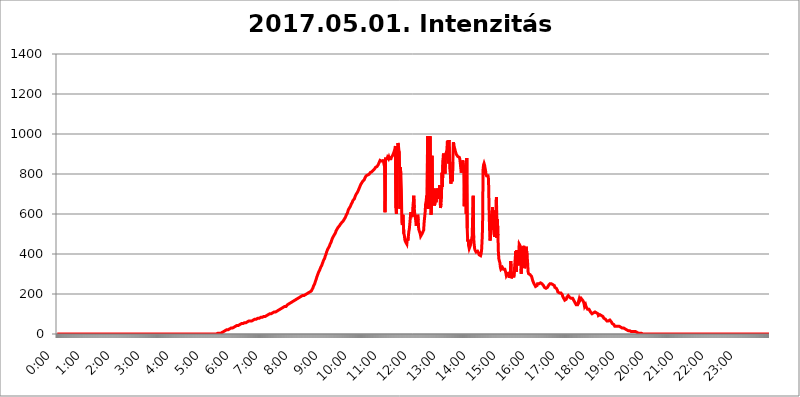
| Category | 2017.05.01. Intenzitás [W/m^2] |
|---|---|
| 0.0 | 0 |
| 0.0006944444444444445 | 0 |
| 0.001388888888888889 | 0 |
| 0.0020833333333333333 | 0 |
| 0.002777777777777778 | 0 |
| 0.003472222222222222 | 0 |
| 0.004166666666666667 | 0 |
| 0.004861111111111111 | 0 |
| 0.005555555555555556 | 0 |
| 0.0062499999999999995 | 0 |
| 0.006944444444444444 | 0 |
| 0.007638888888888889 | 0 |
| 0.008333333333333333 | 0 |
| 0.009027777777777779 | 0 |
| 0.009722222222222222 | 0 |
| 0.010416666666666666 | 0 |
| 0.011111111111111112 | 0 |
| 0.011805555555555555 | 0 |
| 0.012499999999999999 | 0 |
| 0.013194444444444444 | 0 |
| 0.013888888888888888 | 0 |
| 0.014583333333333332 | 0 |
| 0.015277777777777777 | 0 |
| 0.015972222222222224 | 0 |
| 0.016666666666666666 | 0 |
| 0.017361111111111112 | 0 |
| 0.018055555555555557 | 0 |
| 0.01875 | 0 |
| 0.019444444444444445 | 0 |
| 0.02013888888888889 | 0 |
| 0.020833333333333332 | 0 |
| 0.02152777777777778 | 0 |
| 0.022222222222222223 | 0 |
| 0.02291666666666667 | 0 |
| 0.02361111111111111 | 0 |
| 0.024305555555555556 | 0 |
| 0.024999999999999998 | 0 |
| 0.025694444444444447 | 0 |
| 0.02638888888888889 | 0 |
| 0.027083333333333334 | 0 |
| 0.027777777777777776 | 0 |
| 0.02847222222222222 | 0 |
| 0.029166666666666664 | 0 |
| 0.029861111111111113 | 0 |
| 0.030555555555555555 | 0 |
| 0.03125 | 0 |
| 0.03194444444444445 | 0 |
| 0.03263888888888889 | 0 |
| 0.03333333333333333 | 0 |
| 0.034027777777777775 | 0 |
| 0.034722222222222224 | 0 |
| 0.035416666666666666 | 0 |
| 0.036111111111111115 | 0 |
| 0.03680555555555556 | 0 |
| 0.0375 | 0 |
| 0.03819444444444444 | 0 |
| 0.03888888888888889 | 0 |
| 0.03958333333333333 | 0 |
| 0.04027777777777778 | 0 |
| 0.04097222222222222 | 0 |
| 0.041666666666666664 | 0 |
| 0.042361111111111106 | 0 |
| 0.04305555555555556 | 0 |
| 0.043750000000000004 | 0 |
| 0.044444444444444446 | 0 |
| 0.04513888888888889 | 0 |
| 0.04583333333333334 | 0 |
| 0.04652777777777778 | 0 |
| 0.04722222222222222 | 0 |
| 0.04791666666666666 | 0 |
| 0.04861111111111111 | 0 |
| 0.049305555555555554 | 0 |
| 0.049999999999999996 | 0 |
| 0.05069444444444445 | 0 |
| 0.051388888888888894 | 0 |
| 0.052083333333333336 | 0 |
| 0.05277777777777778 | 0 |
| 0.05347222222222222 | 0 |
| 0.05416666666666667 | 0 |
| 0.05486111111111111 | 0 |
| 0.05555555555555555 | 0 |
| 0.05625 | 0 |
| 0.05694444444444444 | 0 |
| 0.057638888888888885 | 0 |
| 0.05833333333333333 | 0 |
| 0.05902777777777778 | 0 |
| 0.059722222222222225 | 0 |
| 0.06041666666666667 | 0 |
| 0.061111111111111116 | 0 |
| 0.06180555555555556 | 0 |
| 0.0625 | 0 |
| 0.06319444444444444 | 0 |
| 0.06388888888888888 | 0 |
| 0.06458333333333334 | 0 |
| 0.06527777777777778 | 0 |
| 0.06597222222222222 | 0 |
| 0.06666666666666667 | 0 |
| 0.06736111111111111 | 0 |
| 0.06805555555555555 | 0 |
| 0.06874999999999999 | 0 |
| 0.06944444444444443 | 0 |
| 0.07013888888888889 | 0 |
| 0.07083333333333333 | 0 |
| 0.07152777777777779 | 0 |
| 0.07222222222222223 | 0 |
| 0.07291666666666667 | 0 |
| 0.07361111111111111 | 0 |
| 0.07430555555555556 | 0 |
| 0.075 | 0 |
| 0.07569444444444444 | 0 |
| 0.0763888888888889 | 0 |
| 0.07708333333333334 | 0 |
| 0.07777777777777778 | 0 |
| 0.07847222222222222 | 0 |
| 0.07916666666666666 | 0 |
| 0.0798611111111111 | 0 |
| 0.08055555555555556 | 0 |
| 0.08125 | 0 |
| 0.08194444444444444 | 0 |
| 0.08263888888888889 | 0 |
| 0.08333333333333333 | 0 |
| 0.08402777777777777 | 0 |
| 0.08472222222222221 | 0 |
| 0.08541666666666665 | 0 |
| 0.08611111111111112 | 0 |
| 0.08680555555555557 | 0 |
| 0.08750000000000001 | 0 |
| 0.08819444444444445 | 0 |
| 0.08888888888888889 | 0 |
| 0.08958333333333333 | 0 |
| 0.09027777777777778 | 0 |
| 0.09097222222222222 | 0 |
| 0.09166666666666667 | 0 |
| 0.09236111111111112 | 0 |
| 0.09305555555555556 | 0 |
| 0.09375 | 0 |
| 0.09444444444444444 | 0 |
| 0.09513888888888888 | 0 |
| 0.09583333333333333 | 0 |
| 0.09652777777777777 | 0 |
| 0.09722222222222222 | 0 |
| 0.09791666666666667 | 0 |
| 0.09861111111111111 | 0 |
| 0.09930555555555555 | 0 |
| 0.09999999999999999 | 0 |
| 0.10069444444444443 | 0 |
| 0.1013888888888889 | 0 |
| 0.10208333333333335 | 0 |
| 0.10277777777777779 | 0 |
| 0.10347222222222223 | 0 |
| 0.10416666666666667 | 0 |
| 0.10486111111111111 | 0 |
| 0.10555555555555556 | 0 |
| 0.10625 | 0 |
| 0.10694444444444444 | 0 |
| 0.1076388888888889 | 0 |
| 0.10833333333333334 | 0 |
| 0.10902777777777778 | 0 |
| 0.10972222222222222 | 0 |
| 0.1111111111111111 | 0 |
| 0.11180555555555556 | 0 |
| 0.11180555555555556 | 0 |
| 0.1125 | 0 |
| 0.11319444444444444 | 0 |
| 0.11388888888888889 | 0 |
| 0.11458333333333333 | 0 |
| 0.11527777777777777 | 0 |
| 0.11597222222222221 | 0 |
| 0.11666666666666665 | 0 |
| 0.1173611111111111 | 0 |
| 0.11805555555555557 | 0 |
| 0.11944444444444445 | 0 |
| 0.12013888888888889 | 0 |
| 0.12083333333333333 | 0 |
| 0.12152777777777778 | 0 |
| 0.12222222222222223 | 0 |
| 0.12291666666666667 | 0 |
| 0.12291666666666667 | 0 |
| 0.12361111111111112 | 0 |
| 0.12430555555555556 | 0 |
| 0.125 | 0 |
| 0.12569444444444444 | 0 |
| 0.12638888888888888 | 0 |
| 0.12708333333333333 | 0 |
| 0.16875 | 0 |
| 0.12847222222222224 | 0 |
| 0.12916666666666668 | 0 |
| 0.12986111111111112 | 0 |
| 0.13055555555555556 | 0 |
| 0.13125 | 0 |
| 0.13194444444444445 | 0 |
| 0.1326388888888889 | 0 |
| 0.13333333333333333 | 0 |
| 0.13402777777777777 | 0 |
| 0.13402777777777777 | 0 |
| 0.13472222222222222 | 0 |
| 0.13541666666666666 | 0 |
| 0.1361111111111111 | 0 |
| 0.13749999999999998 | 0 |
| 0.13819444444444443 | 0 |
| 0.1388888888888889 | 0 |
| 0.13958333333333334 | 0 |
| 0.14027777777777778 | 0 |
| 0.14097222222222222 | 0 |
| 0.14166666666666666 | 0 |
| 0.1423611111111111 | 0 |
| 0.14305555555555557 | 0 |
| 0.14375000000000002 | 0 |
| 0.14444444444444446 | 0 |
| 0.1451388888888889 | 0 |
| 0.1451388888888889 | 0 |
| 0.14652777777777778 | 0 |
| 0.14722222222222223 | 0 |
| 0.14791666666666667 | 0 |
| 0.1486111111111111 | 0 |
| 0.14930555555555555 | 0 |
| 0.15 | 0 |
| 0.15069444444444444 | 0 |
| 0.15138888888888888 | 0 |
| 0.15208333333333332 | 0 |
| 0.15277777777777776 | 0 |
| 0.15347222222222223 | 0 |
| 0.15416666666666667 | 0 |
| 0.15486111111111112 | 0 |
| 0.15555555555555556 | 0 |
| 0.15625 | 0 |
| 0.15694444444444444 | 0 |
| 0.15763888888888888 | 0 |
| 0.15833333333333333 | 0 |
| 0.15902777777777777 | 0 |
| 0.15972222222222224 | 0 |
| 0.16041666666666668 | 0 |
| 0.16111111111111112 | 0 |
| 0.16180555555555556 | 0 |
| 0.1625 | 0 |
| 0.16319444444444445 | 0 |
| 0.1638888888888889 | 0 |
| 0.16458333333333333 | 0 |
| 0.16527777777777777 | 0 |
| 0.16597222222222222 | 0 |
| 0.16666666666666666 | 0 |
| 0.1673611111111111 | 0 |
| 0.16805555555555554 | 0 |
| 0.16874999999999998 | 0 |
| 0.16944444444444443 | 0 |
| 0.17013888888888887 | 0 |
| 0.1708333333333333 | 0 |
| 0.17152777777777775 | 0 |
| 0.17222222222222225 | 0 |
| 0.1729166666666667 | 0 |
| 0.17361111111111113 | 0 |
| 0.17430555555555557 | 0 |
| 0.17500000000000002 | 0 |
| 0.17569444444444446 | 0 |
| 0.1763888888888889 | 0 |
| 0.17708333333333334 | 0 |
| 0.17777777777777778 | 0 |
| 0.17847222222222223 | 0 |
| 0.17916666666666667 | 0 |
| 0.1798611111111111 | 0 |
| 0.18055555555555555 | 0 |
| 0.18125 | 0 |
| 0.18194444444444444 | 0 |
| 0.1826388888888889 | 0 |
| 0.18333333333333335 | 0 |
| 0.1840277777777778 | 0 |
| 0.18472222222222223 | 0 |
| 0.18541666666666667 | 0 |
| 0.18611111111111112 | 0 |
| 0.18680555555555556 | 0 |
| 0.1875 | 0 |
| 0.18819444444444444 | 0 |
| 0.18888888888888888 | 0 |
| 0.18958333333333333 | 0 |
| 0.19027777777777777 | 0 |
| 0.1909722222222222 | 0 |
| 0.19166666666666665 | 0 |
| 0.19236111111111112 | 0 |
| 0.19305555555555554 | 0 |
| 0.19375 | 0 |
| 0.19444444444444445 | 0 |
| 0.1951388888888889 | 0 |
| 0.19583333333333333 | 0 |
| 0.19652777777777777 | 0 |
| 0.19722222222222222 | 0 |
| 0.19791666666666666 | 0 |
| 0.1986111111111111 | 0 |
| 0.19930555555555554 | 0 |
| 0.19999999999999998 | 0 |
| 0.20069444444444443 | 0 |
| 0.20138888888888887 | 0 |
| 0.2020833333333333 | 0 |
| 0.2027777777777778 | 0 |
| 0.2034722222222222 | 0 |
| 0.2041666666666667 | 0 |
| 0.20486111111111113 | 0 |
| 0.20555555555555557 | 0 |
| 0.20625000000000002 | 0 |
| 0.20694444444444446 | 0 |
| 0.2076388888888889 | 0 |
| 0.20833333333333334 | 0 |
| 0.20902777777777778 | 0 |
| 0.20972222222222223 | 0 |
| 0.21041666666666667 | 0 |
| 0.2111111111111111 | 0 |
| 0.21180555555555555 | 0 |
| 0.2125 | 0 |
| 0.21319444444444444 | 0 |
| 0.2138888888888889 | 0 |
| 0.21458333333333335 | 0 |
| 0.2152777777777778 | 0 |
| 0.21597222222222223 | 0 |
| 0.21666666666666667 | 0 |
| 0.21736111111111112 | 0 |
| 0.21805555555555556 | 0 |
| 0.21875 | 0 |
| 0.21944444444444444 | 0 |
| 0.22013888888888888 | 0 |
| 0.22083333333333333 | 0 |
| 0.22152777777777777 | 0 |
| 0.2222222222222222 | 0 |
| 0.22291666666666665 | 0 |
| 0.2236111111111111 | 3.525 |
| 0.22430555555555556 | 3.525 |
| 0.225 | 3.525 |
| 0.22569444444444445 | 3.525 |
| 0.2263888888888889 | 3.525 |
| 0.22708333333333333 | 3.525 |
| 0.22777777777777777 | 3.525 |
| 0.22847222222222222 | 3.525 |
| 0.22916666666666666 | 3.525 |
| 0.2298611111111111 | 7.887 |
| 0.23055555555555554 | 7.887 |
| 0.23124999999999998 | 7.887 |
| 0.23194444444444443 | 12.257 |
| 0.23263888888888887 | 12.257 |
| 0.2333333333333333 | 12.257 |
| 0.2340277777777778 | 12.257 |
| 0.2347222222222222 | 16.636 |
| 0.2354166666666667 | 16.636 |
| 0.23611111111111113 | 16.636 |
| 0.23680555555555557 | 16.636 |
| 0.23750000000000002 | 21.024 |
| 0.23819444444444446 | 21.024 |
| 0.2388888888888889 | 21.024 |
| 0.23958333333333334 | 21.024 |
| 0.24027777777777778 | 25.419 |
| 0.24097222222222223 | 25.419 |
| 0.24166666666666667 | 25.419 |
| 0.2423611111111111 | 25.419 |
| 0.24305555555555555 | 29.823 |
| 0.24375 | 29.823 |
| 0.24444444444444446 | 29.823 |
| 0.24513888888888888 | 29.823 |
| 0.24583333333333335 | 29.823 |
| 0.2465277777777778 | 34.234 |
| 0.24722222222222223 | 34.234 |
| 0.24791666666666667 | 34.234 |
| 0.24861111111111112 | 38.653 |
| 0.24930555555555556 | 38.653 |
| 0.25 | 38.653 |
| 0.25069444444444444 | 38.653 |
| 0.2513888888888889 | 38.653 |
| 0.2520833333333333 | 43.079 |
| 0.25277777777777777 | 43.079 |
| 0.2534722222222222 | 43.079 |
| 0.25416666666666665 | 43.079 |
| 0.2548611111111111 | 47.511 |
| 0.2555555555555556 | 47.511 |
| 0.25625000000000003 | 47.511 |
| 0.2569444444444445 | 47.511 |
| 0.2576388888888889 | 47.511 |
| 0.25833333333333336 | 51.951 |
| 0.2590277777777778 | 51.951 |
| 0.25972222222222224 | 51.951 |
| 0.2604166666666667 | 51.951 |
| 0.2611111111111111 | 51.951 |
| 0.26180555555555557 | 56.398 |
| 0.2625 | 56.398 |
| 0.26319444444444445 | 56.398 |
| 0.2638888888888889 | 56.398 |
| 0.26458333333333334 | 56.398 |
| 0.2652777777777778 | 56.398 |
| 0.2659722222222222 | 60.85 |
| 0.26666666666666666 | 60.85 |
| 0.2673611111111111 | 60.85 |
| 0.26805555555555555 | 60.85 |
| 0.26875 | 65.31 |
| 0.26944444444444443 | 65.31 |
| 0.2701388888888889 | 65.31 |
| 0.2708333333333333 | 65.31 |
| 0.27152777777777776 | 65.31 |
| 0.2722222222222222 | 65.31 |
| 0.27291666666666664 | 65.31 |
| 0.2736111111111111 | 69.775 |
| 0.2743055555555555 | 69.775 |
| 0.27499999999999997 | 69.775 |
| 0.27569444444444446 | 69.775 |
| 0.27638888888888885 | 74.246 |
| 0.27708333333333335 | 74.246 |
| 0.2777777777777778 | 74.246 |
| 0.27847222222222223 | 74.246 |
| 0.2791666666666667 | 74.246 |
| 0.2798611111111111 | 74.246 |
| 0.28055555555555556 | 74.246 |
| 0.28125 | 78.722 |
| 0.28194444444444444 | 78.722 |
| 0.2826388888888889 | 78.722 |
| 0.2833333333333333 | 78.722 |
| 0.28402777777777777 | 83.205 |
| 0.2847222222222222 | 83.205 |
| 0.28541666666666665 | 83.205 |
| 0.28611111111111115 | 83.205 |
| 0.28680555555555554 | 83.205 |
| 0.28750000000000003 | 83.205 |
| 0.2881944444444445 | 83.205 |
| 0.2888888888888889 | 87.692 |
| 0.28958333333333336 | 87.692 |
| 0.2902777777777778 | 87.692 |
| 0.29097222222222224 | 87.692 |
| 0.2916666666666667 | 87.692 |
| 0.2923611111111111 | 92.184 |
| 0.29305555555555557 | 92.184 |
| 0.29375 | 92.184 |
| 0.29444444444444445 | 92.184 |
| 0.2951388888888889 | 92.184 |
| 0.29583333333333334 | 96.682 |
| 0.2965277777777778 | 96.682 |
| 0.2972222222222222 | 96.682 |
| 0.29791666666666666 | 101.184 |
| 0.2986111111111111 | 101.184 |
| 0.29930555555555555 | 101.184 |
| 0.3 | 101.184 |
| 0.30069444444444443 | 101.184 |
| 0.3013888888888889 | 105.69 |
| 0.3020833333333333 | 105.69 |
| 0.30277777777777776 | 105.69 |
| 0.3034722222222222 | 110.201 |
| 0.30416666666666664 | 110.201 |
| 0.3048611111111111 | 110.201 |
| 0.3055555555555555 | 110.201 |
| 0.30624999999999997 | 110.201 |
| 0.3069444444444444 | 114.716 |
| 0.3076388888888889 | 114.716 |
| 0.30833333333333335 | 114.716 |
| 0.3090277777777778 | 119.235 |
| 0.30972222222222223 | 119.235 |
| 0.3104166666666667 | 119.235 |
| 0.3111111111111111 | 119.235 |
| 0.31180555555555556 | 123.758 |
| 0.3125 | 123.758 |
| 0.31319444444444444 | 123.758 |
| 0.3138888888888889 | 128.284 |
| 0.3145833333333333 | 128.284 |
| 0.31527777777777777 | 128.284 |
| 0.3159722222222222 | 128.284 |
| 0.31666666666666665 | 132.814 |
| 0.31736111111111115 | 132.814 |
| 0.31805555555555554 | 132.814 |
| 0.31875000000000003 | 137.347 |
| 0.3194444444444445 | 137.347 |
| 0.3201388888888889 | 137.347 |
| 0.32083333333333336 | 137.347 |
| 0.3215277777777778 | 141.884 |
| 0.32222222222222224 | 141.884 |
| 0.3229166666666667 | 146.423 |
| 0.3236111111111111 | 146.423 |
| 0.32430555555555557 | 146.423 |
| 0.325 | 150.964 |
| 0.32569444444444445 | 150.964 |
| 0.3263888888888889 | 150.964 |
| 0.32708333333333334 | 155.509 |
| 0.3277777777777778 | 155.509 |
| 0.3284722222222222 | 155.509 |
| 0.32916666666666666 | 160.056 |
| 0.3298611111111111 | 160.056 |
| 0.33055555555555555 | 160.056 |
| 0.33125 | 164.605 |
| 0.33194444444444443 | 164.605 |
| 0.3326388888888889 | 164.605 |
| 0.3333333333333333 | 169.156 |
| 0.3340277777777778 | 169.156 |
| 0.3347222222222222 | 173.709 |
| 0.3354166666666667 | 173.709 |
| 0.3361111111111111 | 173.709 |
| 0.3368055555555556 | 173.709 |
| 0.33749999999999997 | 178.264 |
| 0.33819444444444446 | 178.264 |
| 0.33888888888888885 | 182.82 |
| 0.33958333333333335 | 182.82 |
| 0.34027777777777773 | 182.82 |
| 0.34097222222222223 | 182.82 |
| 0.3416666666666666 | 187.378 |
| 0.3423611111111111 | 187.378 |
| 0.3430555555555555 | 187.378 |
| 0.34375 | 191.937 |
| 0.3444444444444445 | 191.937 |
| 0.3451388888888889 | 191.937 |
| 0.3458333333333334 | 191.937 |
| 0.34652777777777777 | 196.497 |
| 0.34722222222222227 | 196.497 |
| 0.34791666666666665 | 196.497 |
| 0.34861111111111115 | 201.058 |
| 0.34930555555555554 | 201.058 |
| 0.35000000000000003 | 201.058 |
| 0.3506944444444444 | 205.62 |
| 0.3513888888888889 | 205.62 |
| 0.3520833333333333 | 205.62 |
| 0.3527777777777778 | 210.182 |
| 0.3534722222222222 | 210.182 |
| 0.3541666666666667 | 210.182 |
| 0.3548611111111111 | 214.746 |
| 0.35555555555555557 | 214.746 |
| 0.35625 | 214.746 |
| 0.35694444444444445 | 219.309 |
| 0.3576388888888889 | 219.309 |
| 0.35833333333333334 | 228.436 |
| 0.3590277777777778 | 233 |
| 0.3597222222222222 | 242.127 |
| 0.36041666666666666 | 246.689 |
| 0.3611111111111111 | 251.251 |
| 0.36180555555555555 | 260.373 |
| 0.3625 | 264.932 |
| 0.36319444444444443 | 274.047 |
| 0.3638888888888889 | 283.156 |
| 0.3645833333333333 | 287.709 |
| 0.3652777777777778 | 296.808 |
| 0.3659722222222222 | 301.354 |
| 0.3666666666666667 | 310.44 |
| 0.3673611111111111 | 314.98 |
| 0.3680555555555556 | 319.517 |
| 0.36874999999999997 | 324.052 |
| 0.36944444444444446 | 333.113 |
| 0.37013888888888885 | 337.639 |
| 0.37083333333333335 | 342.162 |
| 0.37152777777777773 | 346.682 |
| 0.37222222222222223 | 355.712 |
| 0.3729166666666666 | 360.221 |
| 0.3736111111111111 | 369.23 |
| 0.3743055555555555 | 373.729 |
| 0.375 | 378.224 |
| 0.3756944444444445 | 387.202 |
| 0.3763888888888889 | 391.685 |
| 0.3770833333333334 | 400.638 |
| 0.37777777777777777 | 409.574 |
| 0.37847222222222227 | 414.035 |
| 0.37916666666666665 | 422.943 |
| 0.37986111111111115 | 422.943 |
| 0.38055555555555554 | 431.833 |
| 0.38125000000000003 | 436.27 |
| 0.3819444444444444 | 440.702 |
| 0.3826388888888889 | 449.551 |
| 0.3833333333333333 | 453.968 |
| 0.3840277777777778 | 458.38 |
| 0.3847222222222222 | 467.187 |
| 0.3854166666666667 | 471.582 |
| 0.3861111111111111 | 480.356 |
| 0.38680555555555557 | 484.735 |
| 0.3875 | 489.108 |
| 0.38819444444444445 | 493.475 |
| 0.3888888888888889 | 497.836 |
| 0.38958333333333334 | 502.192 |
| 0.3902777777777778 | 506.542 |
| 0.3909722222222222 | 515.223 |
| 0.39166666666666666 | 515.223 |
| 0.3923611111111111 | 523.88 |
| 0.39305555555555555 | 528.2 |
| 0.39375 | 532.513 |
| 0.39444444444444443 | 532.513 |
| 0.3951388888888889 | 536.82 |
| 0.3958333333333333 | 541.121 |
| 0.3965277777777778 | 545.416 |
| 0.3972222222222222 | 549.704 |
| 0.3979166666666667 | 549.704 |
| 0.3986111111111111 | 549.704 |
| 0.3993055555555556 | 558.261 |
| 0.39999999999999997 | 558.261 |
| 0.40069444444444446 | 562.53 |
| 0.40138888888888885 | 566.793 |
| 0.40208333333333335 | 566.793 |
| 0.40277777777777773 | 575.299 |
| 0.40347222222222223 | 579.542 |
| 0.4041666666666666 | 583.779 |
| 0.4048611111111111 | 588.009 |
| 0.4055555555555555 | 596.45 |
| 0.40625 | 600.661 |
| 0.4069444444444445 | 604.864 |
| 0.4076388888888889 | 613.252 |
| 0.4083333333333334 | 621.613 |
| 0.40902777777777777 | 625.784 |
| 0.40972222222222227 | 629.948 |
| 0.41041666666666665 | 634.105 |
| 0.41111111111111115 | 638.256 |
| 0.41180555555555554 | 642.4 |
| 0.41250000000000003 | 650.667 |
| 0.4131944444444444 | 654.791 |
| 0.4138888888888889 | 658.909 |
| 0.4145833333333333 | 667.123 |
| 0.4152777777777778 | 667.123 |
| 0.4159722222222222 | 667.123 |
| 0.4166666666666667 | 675.311 |
| 0.4173611111111111 | 683.473 |
| 0.41805555555555557 | 687.544 |
| 0.41875 | 695.666 |
| 0.41944444444444445 | 699.717 |
| 0.4201388888888889 | 703.762 |
| 0.42083333333333334 | 707.8 |
| 0.4215277777777778 | 711.832 |
| 0.4222222222222222 | 715.858 |
| 0.42291666666666666 | 723.889 |
| 0.4236111111111111 | 727.896 |
| 0.42430555555555555 | 735.89 |
| 0.425 | 739.877 |
| 0.42569444444444443 | 747.834 |
| 0.4263888888888889 | 751.803 |
| 0.4270833333333333 | 755.766 |
| 0.4277777777777778 | 759.723 |
| 0.4284722222222222 | 763.674 |
| 0.4291666666666667 | 767.62 |
| 0.4298611111111111 | 767.62 |
| 0.4305555555555556 | 771.559 |
| 0.43124999999999997 | 775.492 |
| 0.43194444444444446 | 783.342 |
| 0.43263888888888885 | 787.258 |
| 0.43333333333333335 | 791.169 |
| 0.43402777777777773 | 791.169 |
| 0.43472222222222223 | 795.074 |
| 0.4354166666666666 | 795.074 |
| 0.4361111111111111 | 795.074 |
| 0.4368055555555555 | 798.974 |
| 0.4375 | 798.974 |
| 0.4381944444444445 | 798.974 |
| 0.4388888888888889 | 806.757 |
| 0.4395833333333334 | 802.868 |
| 0.44027777777777777 | 806.757 |
| 0.44097222222222227 | 810.641 |
| 0.44166666666666665 | 814.519 |
| 0.44236111111111115 | 814.519 |
| 0.44305555555555554 | 818.392 |
| 0.44375000000000003 | 822.26 |
| 0.4444444444444444 | 822.26 |
| 0.4451388888888889 | 826.123 |
| 0.4458333333333333 | 829.981 |
| 0.4465277777777778 | 833.834 |
| 0.4472222222222222 | 833.834 |
| 0.4479166666666667 | 837.682 |
| 0.4486111111111111 | 837.682 |
| 0.44930555555555557 | 837.682 |
| 0.45 | 845.365 |
| 0.45069444444444445 | 849.199 |
| 0.4513888888888889 | 856.855 |
| 0.45208333333333334 | 860.676 |
| 0.4527777777777778 | 868.305 |
| 0.4534722222222222 | 864.493 |
| 0.45416666666666666 | 864.493 |
| 0.4548611111111111 | 864.493 |
| 0.45555555555555555 | 860.676 |
| 0.45625 | 868.305 |
| 0.45694444444444443 | 864.493 |
| 0.4576388888888889 | 872.114 |
| 0.4583333333333333 | 868.305 |
| 0.4590277777777778 | 837.682 |
| 0.4597222222222222 | 609.062 |
| 0.4604166666666667 | 875.918 |
| 0.4611111111111111 | 872.114 |
| 0.4618055555555556 | 872.114 |
| 0.46249999999999997 | 875.918 |
| 0.46319444444444446 | 883.516 |
| 0.46388888888888885 | 883.516 |
| 0.46458333333333335 | 875.918 |
| 0.46527777777777773 | 883.516 |
| 0.46597222222222223 | 875.918 |
| 0.4666666666666666 | 872.114 |
| 0.4673611111111111 | 875.918 |
| 0.4680555555555555 | 875.918 |
| 0.46875 | 883.516 |
| 0.4694444444444445 | 887.309 |
| 0.4701388888888889 | 891.099 |
| 0.4708333333333334 | 894.885 |
| 0.47152777777777777 | 902.447 |
| 0.47222222222222227 | 909.996 |
| 0.47291666666666665 | 917.534 |
| 0.47361111111111115 | 925.06 |
| 0.47430555555555554 | 940.082 |
| 0.47500000000000003 | 629.948 |
| 0.4756944444444444 | 600.661 |
| 0.4763888888888889 | 783.342 |
| 0.4770833333333333 | 906.223 |
| 0.4777777777777778 | 955.071 |
| 0.4784722222222222 | 943.832 |
| 0.4791666666666667 | 917.534 |
| 0.4798611111111111 | 909.996 |
| 0.48055555555555557 | 625.784 |
| 0.48125 | 833.834 |
| 0.48194444444444445 | 795.074 |
| 0.4826388888888889 | 723.889 |
| 0.48333333333333334 | 558.261 |
| 0.4840277777777778 | 545.416 |
| 0.4847222222222222 | 596.45 |
| 0.48541666666666666 | 592.233 |
| 0.4861111111111111 | 502.192 |
| 0.48680555555555555 | 493.475 |
| 0.4875 | 471.582 |
| 0.48819444444444443 | 462.786 |
| 0.4888888888888889 | 458.38 |
| 0.4895833333333333 | 458.38 |
| 0.4902777777777778 | 449.551 |
| 0.4909722222222222 | 475.972 |
| 0.4916666666666667 | 467.187 |
| 0.4923611111111111 | 484.735 |
| 0.4930555555555556 | 510.885 |
| 0.49374999999999997 | 523.88 |
| 0.49444444444444446 | 549.704 |
| 0.49513888888888885 | 553.986 |
| 0.49583333333333335 | 609.062 |
| 0.49652777777777773 | 609.062 |
| 0.49722222222222223 | 596.45 |
| 0.4979166666666666 | 604.864 |
| 0.4986111111111111 | 588.009 |
| 0.4993055555555555 | 650.667 |
| 0.5 | 691.608 |
| 0.5006944444444444 | 629.948 |
| 0.5013888888888889 | 600.661 |
| 0.5020833333333333 | 600.661 |
| 0.5027777777777778 | 566.793 |
| 0.5034722222222222 | 541.121 |
| 0.5041666666666667 | 549.704 |
| 0.5048611111111111 | 566.793 |
| 0.5055555555555555 | 596.45 |
| 0.50625 | 571.049 |
| 0.5069444444444444 | 523.88 |
| 0.5076388888888889 | 519.555 |
| 0.5083333333333333 | 528.2 |
| 0.5090277777777777 | 502.192 |
| 0.5097222222222222 | 489.108 |
| 0.5104166666666666 | 484.735 |
| 0.5111111111111112 | 489.108 |
| 0.5118055555555555 | 502.192 |
| 0.5125000000000001 | 502.192 |
| 0.5131944444444444 | 502.192 |
| 0.513888888888889 | 519.555 |
| 0.5145833333333333 | 558.261 |
| 0.5152777777777778 | 583.779 |
| 0.5159722222222222 | 609.062 |
| 0.5166666666666667 | 650.667 |
| 0.517361111111111 | 663.019 |
| 0.5180555555555556 | 691.608 |
| 0.5187499999999999 | 658.909 |
| 0.5194444444444445 | 988.714 |
| 0.5201388888888888 | 625.784 |
| 0.5208333333333334 | 650.667 |
| 0.5215277777777778 | 727.896 |
| 0.5222222222222223 | 826.123 |
| 0.5229166666666667 | 988.714 |
| 0.5236111111111111 | 759.723 |
| 0.5243055555555556 | 596.45 |
| 0.525 | 646.537 |
| 0.5256944444444445 | 891.099 |
| 0.5263888888888889 | 671.22 |
| 0.5270833333333333 | 658.909 |
| 0.5277777777777778 | 671.22 |
| 0.5284722222222222 | 727.896 |
| 0.5291666666666667 | 642.4 |
| 0.5298611111111111 | 658.909 |
| 0.5305555555555556 | 719.877 |
| 0.53125 | 658.909 |
| 0.5319444444444444 | 691.608 |
| 0.5326388888888889 | 727.896 |
| 0.5333333333333333 | 711.832 |
| 0.5340277777777778 | 715.858 |
| 0.5347222222222222 | 675.311 |
| 0.5354166666666667 | 683.473 |
| 0.5361111111111111 | 743.859 |
| 0.5368055555555555 | 695.666 |
| 0.5375 | 629.948 |
| 0.5381944444444444 | 650.667 |
| 0.5388888888888889 | 683.473 |
| 0.5395833333333333 | 806.757 |
| 0.5402777777777777 | 735.89 |
| 0.5409722222222222 | 868.305 |
| 0.5416666666666666 | 902.447 |
| 0.5423611111111112 | 872.114 |
| 0.5430555555555555 | 883.516 |
| 0.5437500000000001 | 802.868 |
| 0.5444444444444444 | 879.719 |
| 0.545138888888889 | 902.447 |
| 0.5458333333333333 | 909.996 |
| 0.5465277777777778 | 921.298 |
| 0.5472222222222222 | 966.295 |
| 0.5479166666666667 | 932.576 |
| 0.548611111111111 | 853.029 |
| 0.5493055555555556 | 970.034 |
| 0.5499999999999999 | 894.885 |
| 0.5506944444444445 | 822.26 |
| 0.5513888888888888 | 798.974 |
| 0.5520833333333334 | 751.803 |
| 0.5527777777777778 | 755.766 |
| 0.5534722222222223 | 818.392 |
| 0.5541666666666667 | 763.674 |
| 0.5548611111111111 | 860.676 |
| 0.5555555555555556 | 958.814 |
| 0.55625 | 947.58 |
| 0.5569444444444445 | 932.576 |
| 0.5576388888888889 | 925.06 |
| 0.5583333333333333 | 913.766 |
| 0.5590277777777778 | 906.223 |
| 0.5597222222222222 | 898.668 |
| 0.5604166666666667 | 894.885 |
| 0.5611111111111111 | 894.885 |
| 0.5618055555555556 | 887.309 |
| 0.5625 | 883.516 |
| 0.5631944444444444 | 887.309 |
| 0.5638888888888889 | 883.516 |
| 0.5645833333333333 | 875.918 |
| 0.5652777777777778 | 879.719 |
| 0.5659722222222222 | 879.719 |
| 0.5666666666666667 | 806.757 |
| 0.5673611111111111 | 829.981 |
| 0.5680555555555555 | 841.526 |
| 0.56875 | 868.305 |
| 0.5694444444444444 | 864.493 |
| 0.5701388888888889 | 829.981 |
| 0.5708333333333333 | 638.256 |
| 0.5715277777777777 | 845.365 |
| 0.5722222222222222 | 826.123 |
| 0.5729166666666666 | 743.859 |
| 0.5736111111111112 | 600.661 |
| 0.5743055555555555 | 879.719 |
| 0.5750000000000001 | 528.2 |
| 0.5756944444444444 | 462.786 |
| 0.576388888888889 | 471.582 |
| 0.5770833333333333 | 440.702 |
| 0.5777777777777778 | 427.39 |
| 0.5784722222222222 | 427.39 |
| 0.5791666666666667 | 440.702 |
| 0.579861111111111 | 449.551 |
| 0.5805555555555556 | 458.38 |
| 0.5812499999999999 | 475.972 |
| 0.5819444444444445 | 489.108 |
| 0.5826388888888888 | 489.108 |
| 0.5833333333333334 | 691.608 |
| 0.5840277777777778 | 480.356 |
| 0.5847222222222223 | 449.551 |
| 0.5854166666666667 | 427.39 |
| 0.5861111111111111 | 418.492 |
| 0.5868055555555556 | 414.035 |
| 0.5875 | 409.574 |
| 0.5881944444444445 | 405.108 |
| 0.5888888888888889 | 405.108 |
| 0.5895833333333333 | 414.035 |
| 0.5902777777777778 | 418.492 |
| 0.5909722222222222 | 405.108 |
| 0.5916666666666667 | 396.164 |
| 0.5923611111111111 | 391.685 |
| 0.5930555555555556 | 391.685 |
| 0.59375 | 391.685 |
| 0.5944444444444444 | 400.638 |
| 0.5951388888888889 | 418.492 |
| 0.5958333333333333 | 467.187 |
| 0.5965277777777778 | 532.513 |
| 0.5972222222222222 | 822.26 |
| 0.5979166666666667 | 845.365 |
| 0.5986111111111111 | 853.029 |
| 0.5993055555555555 | 845.365 |
| 0.6 | 829.981 |
| 0.6006944444444444 | 818.392 |
| 0.6013888888888889 | 798.974 |
| 0.6020833333333333 | 791.169 |
| 0.6027777777777777 | 791.169 |
| 0.6034722222222222 | 795.074 |
| 0.6041666666666666 | 791.169 |
| 0.6048611111111112 | 775.492 |
| 0.6055555555555555 | 646.537 |
| 0.6062500000000001 | 532.513 |
| 0.6069444444444444 | 467.187 |
| 0.607638888888889 | 484.735 |
| 0.6083333333333333 | 515.223 |
| 0.6090277777777778 | 600.661 |
| 0.6097222222222222 | 532.513 |
| 0.6104166666666667 | 634.105 |
| 0.611111111111111 | 553.986 |
| 0.6118055555555556 | 519.555 |
| 0.6124999999999999 | 566.793 |
| 0.6131944444444445 | 484.735 |
| 0.6138888888888888 | 480.356 |
| 0.6145833333333334 | 617.436 |
| 0.6152777777777778 | 575.299 |
| 0.6159722222222223 | 683.473 |
| 0.6166666666666667 | 480.356 |
| 0.6173611111111111 | 575.299 |
| 0.6180555555555556 | 493.475 |
| 0.61875 | 405.108 |
| 0.6194444444444445 | 373.729 |
| 0.6201388888888889 | 364.728 |
| 0.6208333333333333 | 355.712 |
| 0.6215277777777778 | 333.113 |
| 0.6222222222222222 | 324.052 |
| 0.6229166666666667 | 324.052 |
| 0.6236111111111111 | 328.584 |
| 0.6243055555555556 | 333.113 |
| 0.625 | 328.584 |
| 0.6256944444444444 | 324.052 |
| 0.6263888888888889 | 328.584 |
| 0.6270833333333333 | 324.052 |
| 0.6277777777777778 | 324.052 |
| 0.6284722222222222 | 314.98 |
| 0.6291666666666667 | 305.898 |
| 0.6298611111111111 | 292.259 |
| 0.6305555555555555 | 287.709 |
| 0.63125 | 301.354 |
| 0.6319444444444444 | 310.44 |
| 0.6326388888888889 | 296.808 |
| 0.6333333333333333 | 287.709 |
| 0.6340277777777777 | 287.709 |
| 0.6347222222222222 | 283.156 |
| 0.6354166666666666 | 287.709 |
| 0.6361111111111112 | 364.728 |
| 0.6368055555555555 | 278.603 |
| 0.6375000000000001 | 274.047 |
| 0.6381944444444444 | 283.156 |
| 0.638888888888889 | 296.808 |
| 0.6395833333333333 | 296.808 |
| 0.6402777777777778 | 283.156 |
| 0.6409722222222222 | 310.44 |
| 0.6416666666666667 | 310.44 |
| 0.642361111111111 | 314.98 |
| 0.6430555555555556 | 414.035 |
| 0.6437499999999999 | 310.44 |
| 0.6444444444444445 | 418.492 |
| 0.6451388888888888 | 360.221 |
| 0.6458333333333334 | 351.198 |
| 0.6465277777777778 | 342.162 |
| 0.6472222222222223 | 405.108 |
| 0.6479166666666667 | 449.551 |
| 0.6486111111111111 | 449.551 |
| 0.6493055555555556 | 440.702 |
| 0.65 | 431.833 |
| 0.6506944444444445 | 301.354 |
| 0.6513888888888889 | 301.354 |
| 0.6520833333333333 | 422.943 |
| 0.6527777777777778 | 346.682 |
| 0.6534722222222222 | 378.224 |
| 0.6541666666666667 | 440.702 |
| 0.6548611111111111 | 355.712 |
| 0.6555555555555556 | 328.584 |
| 0.65625 | 333.113 |
| 0.6569444444444444 | 351.198 |
| 0.6576388888888889 | 436.27 |
| 0.6583333333333333 | 440.702 |
| 0.6590277777777778 | 391.685 |
| 0.6597222222222222 | 355.712 |
| 0.6604166666666667 | 310.44 |
| 0.6611111111111111 | 301.354 |
| 0.6618055555555555 | 305.898 |
| 0.6625 | 296.808 |
| 0.6631944444444444 | 296.808 |
| 0.6638888888888889 | 292.259 |
| 0.6645833333333333 | 301.354 |
| 0.6652777777777777 | 287.709 |
| 0.6659722222222222 | 278.603 |
| 0.6666666666666666 | 269.49 |
| 0.6673611111111111 | 264.932 |
| 0.6680555555555556 | 255.813 |
| 0.6687500000000001 | 251.251 |
| 0.6694444444444444 | 246.689 |
| 0.6701388888888888 | 242.127 |
| 0.6708333333333334 | 237.564 |
| 0.6715277777777778 | 242.127 |
| 0.6722222222222222 | 242.127 |
| 0.6729166666666666 | 242.127 |
| 0.6736111111111112 | 251.251 |
| 0.6743055555555556 | 251.251 |
| 0.6749999999999999 | 246.689 |
| 0.6756944444444444 | 251.251 |
| 0.6763888888888889 | 255.813 |
| 0.6770833333333334 | 255.813 |
| 0.6777777777777777 | 255.813 |
| 0.6784722222222223 | 255.813 |
| 0.6791666666666667 | 251.251 |
| 0.6798611111111111 | 251.251 |
| 0.6805555555555555 | 251.251 |
| 0.68125 | 246.689 |
| 0.6819444444444445 | 242.127 |
| 0.6826388888888889 | 237.564 |
| 0.6833333333333332 | 233 |
| 0.6840277777777778 | 228.436 |
| 0.6847222222222222 | 233 |
| 0.6854166666666667 | 228.436 |
| 0.686111111111111 | 228.436 |
| 0.6868055555555556 | 233 |
| 0.6875 | 233 |
| 0.6881944444444444 | 237.564 |
| 0.688888888888889 | 242.127 |
| 0.6895833333333333 | 246.689 |
| 0.6902777777777778 | 246.689 |
| 0.6909722222222222 | 251.251 |
| 0.6916666666666668 | 251.251 |
| 0.6923611111111111 | 251.251 |
| 0.6930555555555555 | 251.251 |
| 0.69375 | 251.251 |
| 0.6944444444444445 | 251.251 |
| 0.6951388888888889 | 246.689 |
| 0.6958333333333333 | 246.689 |
| 0.6965277777777777 | 246.689 |
| 0.6972222222222223 | 242.127 |
| 0.6979166666666666 | 233 |
| 0.6986111111111111 | 233 |
| 0.6993055555555556 | 228.436 |
| 0.7000000000000001 | 228.436 |
| 0.7006944444444444 | 223.873 |
| 0.7013888888888888 | 219.309 |
| 0.7020833333333334 | 210.182 |
| 0.7027777777777778 | 210.182 |
| 0.7034722222222222 | 205.62 |
| 0.7041666666666666 | 205.62 |
| 0.7048611111111112 | 201.058 |
| 0.7055555555555556 | 201.058 |
| 0.7062499999999999 | 205.62 |
| 0.7069444444444444 | 205.62 |
| 0.7076388888888889 | 205.62 |
| 0.7083333333333334 | 196.497 |
| 0.7090277777777777 | 187.378 |
| 0.7097222222222223 | 182.82 |
| 0.7104166666666667 | 178.264 |
| 0.7111111111111111 | 173.709 |
| 0.7118055555555555 | 169.156 |
| 0.7125 | 164.605 |
| 0.7131944444444445 | 169.156 |
| 0.7138888888888889 | 173.709 |
| 0.7145833333333332 | 182.82 |
| 0.7152777777777778 | 187.378 |
| 0.7159722222222222 | 187.378 |
| 0.7166666666666667 | 191.937 |
| 0.717361111111111 | 191.937 |
| 0.7180555555555556 | 187.378 |
| 0.71875 | 182.82 |
| 0.7194444444444444 | 182.82 |
| 0.720138888888889 | 178.264 |
| 0.7208333333333333 | 178.264 |
| 0.7215277777777778 | 178.264 |
| 0.7222222222222222 | 178.264 |
| 0.7229166666666668 | 178.264 |
| 0.7236111111111111 | 178.264 |
| 0.7243055555555555 | 173.709 |
| 0.725 | 164.605 |
| 0.7256944444444445 | 164.605 |
| 0.7263888888888889 | 155.509 |
| 0.7270833333333333 | 150.964 |
| 0.7277777777777777 | 146.423 |
| 0.7284722222222223 | 146.423 |
| 0.7291666666666666 | 146.423 |
| 0.7298611111111111 | 146.423 |
| 0.7305555555555556 | 146.423 |
| 0.7312500000000001 | 150.964 |
| 0.7319444444444444 | 173.709 |
| 0.7326388888888888 | 164.605 |
| 0.7333333333333334 | 164.605 |
| 0.7340277777777778 | 169.156 |
| 0.7347222222222222 | 178.264 |
| 0.7354166666666666 | 173.709 |
| 0.7361111111111112 | 173.709 |
| 0.7368055555555556 | 169.156 |
| 0.7374999999999999 | 164.605 |
| 0.7381944444444444 | 160.056 |
| 0.7388888888888889 | 150.964 |
| 0.7395833333333334 | 137.347 |
| 0.7402777777777777 | 137.347 |
| 0.7409722222222223 | 146.423 |
| 0.7416666666666667 | 137.347 |
| 0.7423611111111111 | 137.347 |
| 0.7430555555555555 | 132.814 |
| 0.74375 | 123.758 |
| 0.7444444444444445 | 123.758 |
| 0.7451388888888889 | 128.284 |
| 0.7458333333333332 | 123.758 |
| 0.7465277777777778 | 119.235 |
| 0.7472222222222222 | 119.235 |
| 0.7479166666666667 | 110.201 |
| 0.748611111111111 | 105.69 |
| 0.7493055555555556 | 110.201 |
| 0.75 | 101.184 |
| 0.7506944444444444 | 101.184 |
| 0.751388888888889 | 101.184 |
| 0.7520833333333333 | 105.69 |
| 0.7527777777777778 | 105.69 |
| 0.7534722222222222 | 105.69 |
| 0.7541666666666668 | 110.201 |
| 0.7548611111111111 | 110.201 |
| 0.7555555555555555 | 105.69 |
| 0.75625 | 105.69 |
| 0.7569444444444445 | 105.69 |
| 0.7576388888888889 | 105.69 |
| 0.7583333333333333 | 101.184 |
| 0.7590277777777777 | 92.184 |
| 0.7597222222222223 | 92.184 |
| 0.7604166666666666 | 96.682 |
| 0.7611111111111111 | 96.682 |
| 0.7618055555555556 | 92.184 |
| 0.7625000000000001 | 92.184 |
| 0.7631944444444444 | 92.184 |
| 0.7638888888888888 | 87.692 |
| 0.7645833333333334 | 87.692 |
| 0.7652777777777778 | 87.692 |
| 0.7659722222222222 | 83.205 |
| 0.7666666666666666 | 78.722 |
| 0.7673611111111112 | 78.722 |
| 0.7680555555555556 | 74.246 |
| 0.7687499999999999 | 74.246 |
| 0.7694444444444444 | 74.246 |
| 0.7701388888888889 | 69.775 |
| 0.7708333333333334 | 65.31 |
| 0.7715277777777777 | 65.31 |
| 0.7722222222222223 | 65.31 |
| 0.7729166666666667 | 65.31 |
| 0.7736111111111111 | 69.775 |
| 0.7743055555555555 | 69.775 |
| 0.775 | 69.775 |
| 0.7756944444444445 | 65.31 |
| 0.7763888888888889 | 65.31 |
| 0.7770833333333332 | 60.85 |
| 0.7777777777777778 | 56.398 |
| 0.7784722222222222 | 51.951 |
| 0.7791666666666667 | 51.951 |
| 0.779861111111111 | 47.511 |
| 0.7805555555555556 | 47.511 |
| 0.78125 | 43.079 |
| 0.7819444444444444 | 38.653 |
| 0.782638888888889 | 38.653 |
| 0.7833333333333333 | 38.653 |
| 0.7840277777777778 | 38.653 |
| 0.7847222222222222 | 38.653 |
| 0.7854166666666668 | 38.653 |
| 0.7861111111111111 | 38.653 |
| 0.7868055555555555 | 38.653 |
| 0.7875 | 38.653 |
| 0.7881944444444445 | 38.653 |
| 0.7888888888888889 | 38.653 |
| 0.7895833333333333 | 34.234 |
| 0.7902777777777777 | 34.234 |
| 0.7909722222222223 | 34.234 |
| 0.7916666666666666 | 29.823 |
| 0.7923611111111111 | 29.823 |
| 0.7930555555555556 | 29.823 |
| 0.7937500000000001 | 29.823 |
| 0.7944444444444444 | 29.823 |
| 0.7951388888888888 | 25.419 |
| 0.7958333333333334 | 25.419 |
| 0.7965277777777778 | 25.419 |
| 0.7972222222222222 | 21.024 |
| 0.7979166666666666 | 21.024 |
| 0.7986111111111112 | 21.024 |
| 0.7993055555555556 | 21.024 |
| 0.7999999999999999 | 16.636 |
| 0.8006944444444444 | 16.636 |
| 0.8013888888888889 | 16.636 |
| 0.8020833333333334 | 16.636 |
| 0.8027777777777777 | 16.636 |
| 0.8034722222222223 | 16.636 |
| 0.8041666666666667 | 16.636 |
| 0.8048611111111111 | 12.257 |
| 0.8055555555555555 | 12.257 |
| 0.80625 | 12.257 |
| 0.8069444444444445 | 12.257 |
| 0.8076388888888889 | 12.257 |
| 0.8083333333333332 | 12.257 |
| 0.8090277777777778 | 12.257 |
| 0.8097222222222222 | 12.257 |
| 0.8104166666666667 | 12.257 |
| 0.811111111111111 | 12.257 |
| 0.8118055555555556 | 7.887 |
| 0.8125 | 7.887 |
| 0.8131944444444444 | 7.887 |
| 0.813888888888889 | 7.887 |
| 0.8145833333333333 | 3.525 |
| 0.8152777777777778 | 3.525 |
| 0.8159722222222222 | 3.525 |
| 0.8166666666666668 | 3.525 |
| 0.8173611111111111 | 3.525 |
| 0.8180555555555555 | 3.525 |
| 0.81875 | 3.525 |
| 0.8194444444444445 | 3.525 |
| 0.8201388888888889 | 0 |
| 0.8208333333333333 | 0 |
| 0.8215277777777777 | 0 |
| 0.8222222222222223 | 0 |
| 0.8229166666666666 | 0 |
| 0.8236111111111111 | 0 |
| 0.8243055555555556 | 0 |
| 0.8250000000000001 | 0 |
| 0.8256944444444444 | 0 |
| 0.8263888888888888 | 0 |
| 0.8270833333333334 | 0 |
| 0.8277777777777778 | 0 |
| 0.8284722222222222 | 0 |
| 0.8291666666666666 | 0 |
| 0.8298611111111112 | 0 |
| 0.8305555555555556 | 0 |
| 0.8312499999999999 | 0 |
| 0.8319444444444444 | 0 |
| 0.8326388888888889 | 0 |
| 0.8333333333333334 | 0 |
| 0.8340277777777777 | 0 |
| 0.8347222222222223 | 0 |
| 0.8354166666666667 | 0 |
| 0.8361111111111111 | 0 |
| 0.8368055555555555 | 0 |
| 0.8375 | 0 |
| 0.8381944444444445 | 0 |
| 0.8388888888888889 | 0 |
| 0.8395833333333332 | 0 |
| 0.8402777777777778 | 0 |
| 0.8409722222222222 | 0 |
| 0.8416666666666667 | 0 |
| 0.842361111111111 | 0 |
| 0.8430555555555556 | 0 |
| 0.84375 | 0 |
| 0.8444444444444444 | 0 |
| 0.845138888888889 | 0 |
| 0.8458333333333333 | 0 |
| 0.8465277777777778 | 0 |
| 0.8472222222222222 | 0 |
| 0.8479166666666668 | 0 |
| 0.8486111111111111 | 0 |
| 0.8493055555555555 | 0 |
| 0.85 | 0 |
| 0.8506944444444445 | 0 |
| 0.8513888888888889 | 0 |
| 0.8520833333333333 | 0 |
| 0.8527777777777777 | 0 |
| 0.8534722222222223 | 0 |
| 0.8541666666666666 | 0 |
| 0.8548611111111111 | 0 |
| 0.8555555555555556 | 0 |
| 0.8562500000000001 | 0 |
| 0.8569444444444444 | 0 |
| 0.8576388888888888 | 0 |
| 0.8583333333333334 | 0 |
| 0.8590277777777778 | 0 |
| 0.8597222222222222 | 0 |
| 0.8604166666666666 | 0 |
| 0.8611111111111112 | 0 |
| 0.8618055555555556 | 0 |
| 0.8624999999999999 | 0 |
| 0.8631944444444444 | 0 |
| 0.8638888888888889 | 0 |
| 0.8645833333333334 | 0 |
| 0.8652777777777777 | 0 |
| 0.8659722222222223 | 0 |
| 0.8666666666666667 | 0 |
| 0.8673611111111111 | 0 |
| 0.8680555555555555 | 0 |
| 0.86875 | 0 |
| 0.8694444444444445 | 0 |
| 0.8701388888888889 | 0 |
| 0.8708333333333332 | 0 |
| 0.8715277777777778 | 0 |
| 0.8722222222222222 | 0 |
| 0.8729166666666667 | 0 |
| 0.873611111111111 | 0 |
| 0.8743055555555556 | 0 |
| 0.875 | 0 |
| 0.8756944444444444 | 0 |
| 0.876388888888889 | 0 |
| 0.8770833333333333 | 0 |
| 0.8777777777777778 | 0 |
| 0.8784722222222222 | 0 |
| 0.8791666666666668 | 0 |
| 0.8798611111111111 | 0 |
| 0.8805555555555555 | 0 |
| 0.88125 | 0 |
| 0.8819444444444445 | 0 |
| 0.8826388888888889 | 0 |
| 0.8833333333333333 | 0 |
| 0.8840277777777777 | 0 |
| 0.8847222222222223 | 0 |
| 0.8854166666666666 | 0 |
| 0.8861111111111111 | 0 |
| 0.8868055555555556 | 0 |
| 0.8875000000000001 | 0 |
| 0.8881944444444444 | 0 |
| 0.8888888888888888 | 0 |
| 0.8895833333333334 | 0 |
| 0.8902777777777778 | 0 |
| 0.8909722222222222 | 0 |
| 0.8916666666666666 | 0 |
| 0.8923611111111112 | 0 |
| 0.8930555555555556 | 0 |
| 0.8937499999999999 | 0 |
| 0.8944444444444444 | 0 |
| 0.8951388888888889 | 0 |
| 0.8958333333333334 | 0 |
| 0.8965277777777777 | 0 |
| 0.8972222222222223 | 0 |
| 0.8979166666666667 | 0 |
| 0.8986111111111111 | 0 |
| 0.8993055555555555 | 0 |
| 0.9 | 0 |
| 0.9006944444444445 | 0 |
| 0.9013888888888889 | 0 |
| 0.9020833333333332 | 0 |
| 0.9027777777777778 | 0 |
| 0.9034722222222222 | 0 |
| 0.9041666666666667 | 0 |
| 0.904861111111111 | 0 |
| 0.9055555555555556 | 0 |
| 0.90625 | 0 |
| 0.9069444444444444 | 0 |
| 0.907638888888889 | 0 |
| 0.9083333333333333 | 0 |
| 0.9090277777777778 | 0 |
| 0.9097222222222222 | 0 |
| 0.9104166666666668 | 0 |
| 0.9111111111111111 | 0 |
| 0.9118055555555555 | 0 |
| 0.9125 | 0 |
| 0.9131944444444445 | 0 |
| 0.9138888888888889 | 0 |
| 0.9145833333333333 | 0 |
| 0.9152777777777777 | 0 |
| 0.9159722222222223 | 0 |
| 0.9166666666666666 | 0 |
| 0.9173611111111111 | 0 |
| 0.9180555555555556 | 0 |
| 0.9187500000000001 | 0 |
| 0.9194444444444444 | 0 |
| 0.9201388888888888 | 0 |
| 0.9208333333333334 | 0 |
| 0.9215277777777778 | 0 |
| 0.9222222222222222 | 0 |
| 0.9229166666666666 | 0 |
| 0.9236111111111112 | 0 |
| 0.9243055555555556 | 0 |
| 0.9249999999999999 | 0 |
| 0.9256944444444444 | 0 |
| 0.9263888888888889 | 0 |
| 0.9270833333333334 | 0 |
| 0.9277777777777777 | 0 |
| 0.9284722222222223 | 0 |
| 0.9291666666666667 | 0 |
| 0.9298611111111111 | 0 |
| 0.9305555555555555 | 0 |
| 0.93125 | 0 |
| 0.9319444444444445 | 0 |
| 0.9326388888888889 | 0 |
| 0.9333333333333332 | 0 |
| 0.9340277777777778 | 0 |
| 0.9347222222222222 | 0 |
| 0.9354166666666667 | 0 |
| 0.936111111111111 | 0 |
| 0.9368055555555556 | 0 |
| 0.9375 | 0 |
| 0.9381944444444444 | 0 |
| 0.938888888888889 | 0 |
| 0.9395833333333333 | 0 |
| 0.9402777777777778 | 0 |
| 0.9409722222222222 | 0 |
| 0.9416666666666668 | 0 |
| 0.9423611111111111 | 0 |
| 0.9430555555555555 | 0 |
| 0.94375 | 0 |
| 0.9444444444444445 | 0 |
| 0.9451388888888889 | 0 |
| 0.9458333333333333 | 0 |
| 0.9465277777777777 | 0 |
| 0.9472222222222223 | 0 |
| 0.9479166666666666 | 0 |
| 0.9486111111111111 | 0 |
| 0.9493055555555556 | 0 |
| 0.9500000000000001 | 0 |
| 0.9506944444444444 | 0 |
| 0.9513888888888888 | 0 |
| 0.9520833333333334 | 0 |
| 0.9527777777777778 | 0 |
| 0.9534722222222222 | 0 |
| 0.9541666666666666 | 0 |
| 0.9548611111111112 | 0 |
| 0.9555555555555556 | 0 |
| 0.9562499999999999 | 0 |
| 0.9569444444444444 | 0 |
| 0.9576388888888889 | 0 |
| 0.9583333333333334 | 0 |
| 0.9590277777777777 | 0 |
| 0.9597222222222223 | 0 |
| 0.9604166666666667 | 0 |
| 0.9611111111111111 | 0 |
| 0.9618055555555555 | 0 |
| 0.9625 | 0 |
| 0.9631944444444445 | 0 |
| 0.9638888888888889 | 0 |
| 0.9645833333333332 | 0 |
| 0.9652777777777778 | 0 |
| 0.9659722222222222 | 0 |
| 0.9666666666666667 | 0 |
| 0.967361111111111 | 0 |
| 0.9680555555555556 | 0 |
| 0.96875 | 0 |
| 0.9694444444444444 | 0 |
| 0.970138888888889 | 0 |
| 0.9708333333333333 | 0 |
| 0.9715277777777778 | 0 |
| 0.9722222222222222 | 0 |
| 0.9729166666666668 | 0 |
| 0.9736111111111111 | 0 |
| 0.9743055555555555 | 0 |
| 0.975 | 0 |
| 0.9756944444444445 | 0 |
| 0.9763888888888889 | 0 |
| 0.9770833333333333 | 0 |
| 0.9777777777777777 | 0 |
| 0.9784722222222223 | 0 |
| 0.9791666666666666 | 0 |
| 0.9798611111111111 | 0 |
| 0.9805555555555556 | 0 |
| 0.9812500000000001 | 0 |
| 0.9819444444444444 | 0 |
| 0.9826388888888888 | 0 |
| 0.9833333333333334 | 0 |
| 0.9840277777777778 | 0 |
| 0.9847222222222222 | 0 |
| 0.9854166666666666 | 0 |
| 0.9861111111111112 | 0 |
| 0.9868055555555556 | 0 |
| 0.9874999999999999 | 0 |
| 0.9881944444444444 | 0 |
| 0.9888888888888889 | 0 |
| 0.9895833333333334 | 0 |
| 0.9902777777777777 | 0 |
| 0.9909722222222223 | 0 |
| 0.9916666666666667 | 0 |
| 0.9923611111111111 | 0 |
| 0.9930555555555555 | 0 |
| 0.99375 | 0 |
| 0.9944444444444445 | 0 |
| 0.9951388888888889 | 0 |
| 0.9958333333333332 | 0 |
| 0.9965277777777778 | 0 |
| 0.9972222222222222 | 0 |
| 0.9979166666666667 | 0 |
| 0.998611111111111 | 0 |
| 0.9993055555555556 | 0 |